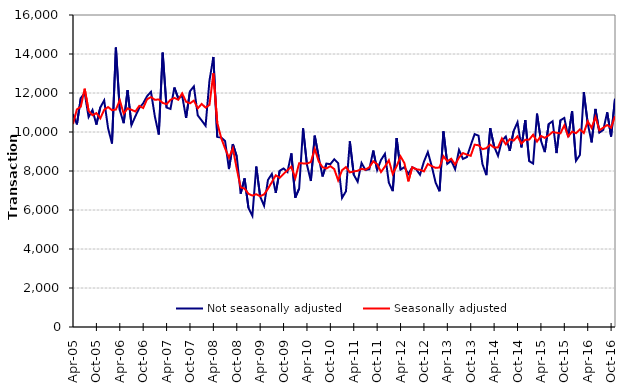
| Category | Not seasonally adjusted | Seasonally adjusted |
|---|---|---|
| 2005-04-01 | 10920 | 10410 |
| 2005-05-01 | 10390 | 11160 |
| 2005-06-01 | 11740 | 11300 |
| 2005-07-01 | 12000 | 12220 |
| 2005-08-01 | 10770 | 11090 |
| 2005-09-01 | 11130 | 10860 |
| 2005-10-01 | 10380 | 10970 |
| 2005-11-01 | 11260 | 10700 |
| 2005-12-01 | 11620 | 11140 |
| 2006-01-01 | 10190 | 11280 |
| 2006-02-01 | 9410 | 11120 |
| 2006-03-01 | 14330 | 11150 |
| 2006-04-01 | 11120 | 11630 |
| 2006-05-01 | 10450 | 10940 |
| 2006-06-01 | 12150 | 11210 |
| 2006-07-01 | 10360 | 11140 |
| 2006-08-01 | 10810 | 11050 |
| 2006-09-01 | 11230 | 11340 |
| 2006-10-01 | 11470 | 11230 |
| 2006-11-01 | 11840 | 11680 |
| 2006-12-01 | 12060 | 11790 |
| 2007-01-01 | 10790 | 11650 |
| 2007-02-01 | 9870 | 11670 |
| 2007-03-01 | 14070 | 11490 |
| 2007-04-01 | 11250 | 11430 |
| 2007-05-01 | 11180 | 11650 |
| 2007-06-01 | 12280 | 11750 |
| 2007-07-01 | 11720 | 11650 |
| 2007-08-01 | 11860 | 11980 |
| 2007-09-01 | 10720 | 11550 |
| 2007-10-01 | 12090 | 11470 |
| 2007-11-01 | 12340 | 11610 |
| 2007-12-01 | 10850 | 11210 |
| 2008-01-01 | 10590 | 11440 |
| 2008-02-01 | 10320 | 11250 |
| 2008-03-01 | 12640 | 11390 |
| 2008-04-01 | 13850 | 13010 |
| 2008-05-01 | 9750 | 10470 |
| 2008-06-01 | 9720 | 9690 |
| 2008-07-01 | 9540 | 9160 |
| 2008-08-01 | 8100 | 8680 |
| 2008-09-01 | 9380 | 9160 |
| 2008-10-01 | 8740 | 8110 |
| 2008-11-01 | 6840 | 7160 |
| 2008-12-01 | 7620 | 7100 |
| 2009-01-01 | 6110 | 6830 |
| 2009-02-01 | 5700 | 6740 |
| 2009-03-01 | 8230 | 6810 |
| 2009-04-01 | 6690 | 6710 |
| 2009-05-01 | 6220 | 6800 |
| 2009-06-01 | 7540 | 7090 |
| 2009-07-01 | 7850 | 7430 |
| 2009-08-01 | 6880 | 7780 |
| 2009-09-01 | 8010 | 7650 |
| 2009-10-01 | 8130 | 7850 |
| 2009-11-01 | 7950 | 8040 |
| 2009-12-01 | 8900 | 8220 |
| 2010-01-01 | 6630 | 7630 |
| 2010-02-01 | 7100 | 8400 |
| 2010-03-01 | 10190 | 8390 |
| 2010-04-01 | 8320 | 8380 |
| 2010-05-01 | 7490 | 8460 |
| 2010-06-01 | 9810 | 9140 |
| 2010-07-01 | 8720 | 8500 |
| 2010-08-01 | 7720 | 8190 |
| 2010-09-01 | 8380 | 8130 |
| 2010-10-01 | 8350 | 8250 |
| 2010-11-01 | 8600 | 8100 |
| 2010-12-01 | 8400 | 7520 |
| 2011-01-01 | 6620 | 8040 |
| 2011-02-01 | 6960 | 8200 |
| 2011-03-01 | 9520 | 7930 |
| 2011-04-01 | 7810 | 7980 |
| 2011-05-01 | 7450 | 8010 |
| 2011-06-01 | 8410 | 8110 |
| 2011-07-01 | 8050 | 8070 |
| 2011-08-01 | 8090 | 8190 |
| 2011-09-01 | 9050 | 8500 |
| 2011-10-01 | 8050 | 8350 |
| 2011-11-01 | 8570 | 7950 |
| 2011-12-01 | 8880 | 8230 |
| 2012-01-01 | 7400 | 8550 |
| 2012-02-01 | 6970 | 7840 |
| 2012-03-01 | 9690 | 8240 |
| 2012-04-01 | 8070 | 8750 |
| 2012-05-01 | 8200 | 8400 |
| 2012-06-01 | 7850 | 7470 |
| 2012-07-01 | 8190 | 8190 |
| 2012-08-01 | 8090 | 8090 |
| 2012-09-01 | 7810 | 8060 |
| 2012-10-01 | 8480 | 7980 |
| 2012-11-01 | 8970 | 8360 |
| 2012-12-01 | 8250 | 8250 |
| 2013-01-01 | 7400 | 8160 |
| 2013-02-01 | 6960 | 8180 |
| 2013-03-01 | 10030 | 8760 |
| 2013-04-01 | 8370 | 8500 |
| 2013-05-01 | 8530 | 8630 |
| 2013-06-01 | 8090 | 8330 |
| 2013-07-01 | 9080 | 8690 |
| 2013-08-01 | 8620 | 8920 |
| 2013-09-01 | 8710 | 8840 |
| 2013-10-01 | 9320 | 8780 |
| 2013-11-01 | 9890 | 9350 |
| 2013-12-01 | 9810 | 9320 |
| 2014-01-01 | 8360 | 9120 |
| 2014-02-01 | 7790 | 9170 |
| 2014-03-01 | 10200 | 9350 |
| 2014-04-01 | 9260 | 9200 |
| 2014-05-01 | 8780 | 9210 |
| 2014-06-01 | 9550 | 9670 |
| 2014-07-01 | 9770 | 9370 |
| 2014-08-01 | 9030 | 9630 |
| 2014-09-01 | 10050 | 9560 |
| 2014-10-01 | 10500 | 9780 |
| 2014-11-01 | 9210 | 9410 |
| 2014-12-01 | 10610 | 9600 |
| 2015-01-01 | 8510 | 9610 |
| 2015-02-01 | 8380 | 9860 |
| 2015-03-01 | 10940 | 9510 |
| 2015-04-01 | 9560 | 9800 |
| 2015-05-01 | 8970 | 9700 |
| 2015-06-01 | 10410 | 9830 |
| 2015-07-01 | 10550 | 10000 |
| 2015-08-01 | 8920 | 9960 |
| 2015-09-01 | 10600 | 9930 |
| 2015-10-01 | 10720 | 10340 |
| 2015-11-01 | 9740 | 9770 |
| 2015-12-01 | 11070 | 10020 |
| 2016-01-01 | 8520 | 9940 |
| 2016-02-01 | 8820 | 10130 |
| 2016-03-01 | 12040 | 9950 |
| 2016-04-01 | 10440 | 10550 |
| 2016-05-01 | 9470 | 10210 |
| 2016-06-01 | 11180 | 10770 |
| 2016-07-01 | 9970 | 10090 |
| 2016-08-01 | 10110 | 10220 |
| 2016-09-01 | 11010 | 10360 |
| 2016-10-01 | 9770 | 10220 |
| 2016-11-01 | 11700 | 10810 |